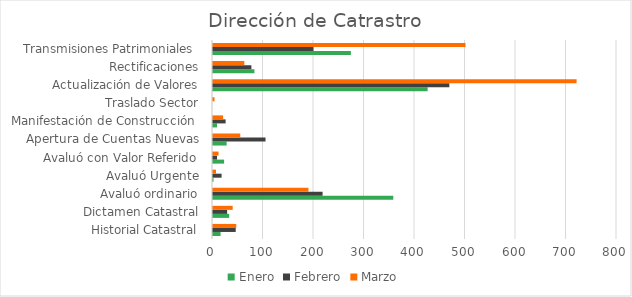
| Category | Enero | Febrero | Marzo |
|---|---|---|---|
| Historial Catastral | 15 | 45 | 46 |
| Dictamen Catastral | 32 | 28 | 39 |
| Avaluó ordinario | 357 | 217 | 189 |
| Avaluó Urgente | 1 | 17 | 6 |
| Avaluó con Valor Referido | 22 | 8 | 11 |
| Apertura de Cuentas Nuevas | 27 | 104 | 54 |
| Manifestación de Construcción  | 8 | 25 | 20 |
| Traslado Sector | 0 | 0 | 3 |
| Actualización de Valores | 425 | 468 | 720 |
| Rectificaciones | 82 | 76 | 62 |
| Transmisiones Patrimoniales  | 273 | 199 | 500 |